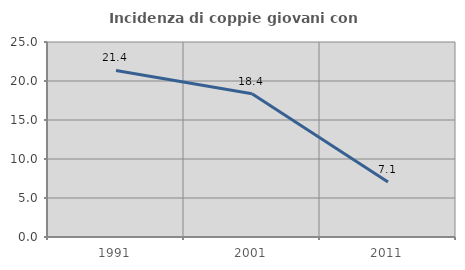
| Category | Incidenza di coppie giovani con figli |
|---|---|
| 1991.0 | 21.359 |
| 2001.0 | 18.367 |
| 2011.0 | 7.059 |